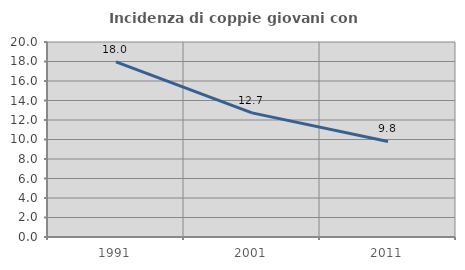
| Category | Incidenza di coppie giovani con figli |
|---|---|
| 1991.0 | 17.969 |
| 2001.0 | 12.73 |
| 2011.0 | 9.803 |